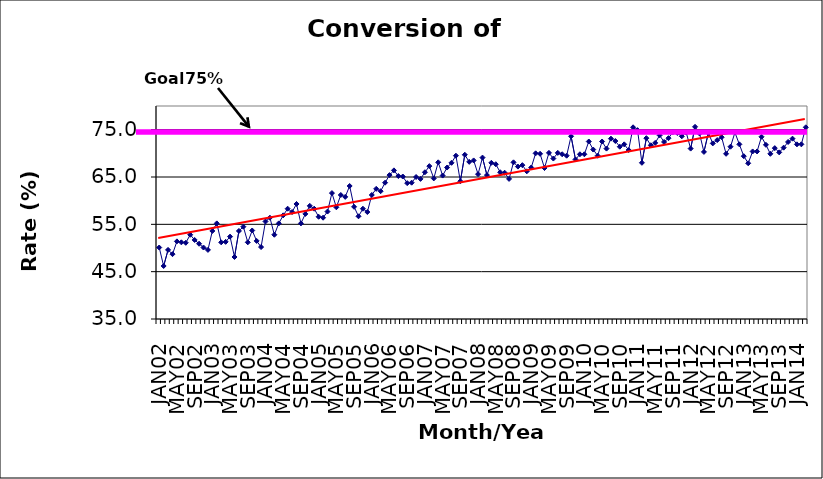
| Category | Series 0 |
|---|---|
| JAN02 | 50.1 |
| FEB02 | 46.2 |
| MAR02 | 49.6 |
| APR02 | 48.7 |
| MAY02 | 51.4 |
| JUN02 | 51.2 |
| JUL02 | 51.1 |
| AUG02 | 52.8 |
| SEP02 | 51.7 |
| OCT02 | 50.9 |
| NOV02 | 50.1 |
| DEC02 | 49.6 |
| JAN03 | 53.6 |
| FEB03 | 55.2 |
| MAR03 | 51.2 |
| APR03 | 51.3 |
| MAY03 | 52.4 |
| JUN03 | 48.1 |
| JUL03 | 53.6 |
| AUG03 | 54.5 |
| SEP03 | 51.2 |
| OCT03 | 53.7 |
| NOV03 | 51.5 |
| DEC03 | 50.2 |
| JAN04 | 55.6 |
| FEB04 | 56.4 |
| MAR04 | 52.8 |
| APR04 | 55.2 |
| MAY04 | 56.9 |
| JUN04 | 58.3 |
| JUL04 | 57.6 |
| AUG04 | 59.3 |
| SEP04 | 55.2 |
| OCT04 | 57.2 |
| NOV04 | 58.9 |
| DEC04 | 58.3 |
| JAN05 | 56.6 |
| FEB05 | 56.4 |
| MAR05 | 57.7 |
| APR05 | 61.6 |
| MAY05 | 58.6 |
| JUN05 | 61.2 |
| JUL05 | 60.8 |
| AUG05 | 63.1 |
| SEP05 | 58.7 |
| OCT05 | 56.7 |
| NOV05 | 58.3 |
| DEC05 | 57.6 |
| JAN06 | 61.2 |
| FEB06 | 62.5 |
| MAR06 | 62 |
| APR06 | 63.8 |
| MAY06 | 65.4 |
| JUN06 | 66.4 |
| JUL06 | 65.2 |
| AUG06 | 65.1 |
| SEP06 | 63.7 |
| OCT06 | 63.8 |
| NOV06 | 65 |
| DEC06 | 64.6 |
| JAN07 | 66 |
| FEB07 | 67.3 |
| MAR07 | 64.7 |
| APR07 | 68.1 |
| MAY07 | 65.3 |
| JUN07 | 67 |
| JUL07 | 68 |
| AUG07 | 69.5 |
| SEP07 | 64.1 |
| OCT07 | 69.7 |
| NOV07 | 68.2 |
| DEC07 | 68.5 |
| JAN08 | 65.6 |
| FEB08 | 69.1 |
| MAR08 | 65.4 |
| APR08 | 68 |
| MAY08 | 67.7 |
| JUN08 | 66 |
| JUL08 | 65.9 |
| AUG08 | 64.6 |
| SEP08 | 68.1 |
| OCT08 | 67.2 |
| NOV08 | 67.5 |
| DEC08 | 66.2 |
| JAN09 | 67 |
| FEB09 | 70 |
| MAR09 | 69.9 |
| APR09 | 66.9 |
| MAY09 | 70.1 |
| JUN09 | 68.9 |
| JUL09 | 70.1 |
| AUG09 | 69.8 |
| SEP09 | 69.5 |
| OCT09 | 73.6 |
| NOV09 | 68.7 |
| DEC09 | 69.8 |
| JAN10 | 69.8 |
| FEB10 | 72.5 |
| MAR10 | 70.8 |
| APR10 | 69.5 |
| MAY10 | 72.5 |
| JUN10 | 71 |
| JUL10 | 73.1 |
| AUG10 | 72.6 |
| SEP10 | 71.4 |
| OCT10 | 71.9 |
| NOV10 | 70.7 |
| DEC10 | 75.5 |
| JAN11 | 74.9 |
| FEB11 | 68 |
| MAR11 | 73.2 |
| APR11 | 71.7 |
| MAY11 | 72.2 |
| JUN11 | 73.8 |
| JUL11 | 72.4 |
| AUG11 | 73.2 |
| SEP11 | 74.5 |
| OCT11 | 74.3 |
| NOV11 | 73.6 |
| DEC11 | 74.4 |
| JAN12 | 71 |
| FEB12 | 75.6 |
| MAR12 | 74.2 |
| APR12 | 70.3 |
| MAY12 | 74.3 |
| JUN12 | 72.1 |
| JUL12 | 72.8 |
| AUG12 | 73.4 |
| SEP12 | 69.9 |
| OCT12 | 71.4 |
| NOV12 | 74.4 |
| DEC12 | 71.9 |
| JAN13 | 69.4 |
| FEB13 | 67.9 |
| MAR13 | 70.4 |
| APR13 | 70.4 |
| MAY13 | 73.5 |
| JUN13 | 71.8 |
| JUL13 | 69.9 |
| AUG13 | 71.1 |
| SEP13 | 70.2 |
| OCT13 | 71.2 |
| NOV13 | 72.4 |
| DEC13 | 73.1 |
| JAN14 | 71.9 |
| FEB14 | 71.9 |
| MAR14 | 75.5 |